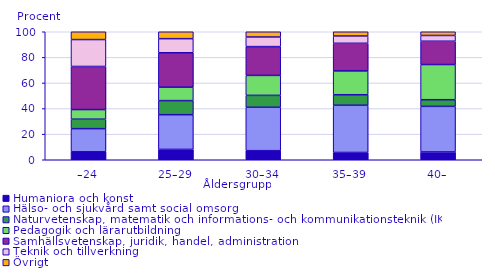
| Category | Humaniora och konst                                                                                                                                    | Hälso- och sjukvård samt social omsorg                                                                                                                 | Naturvetenskap, matematik och informations- och kommunikationsteknik (IKT)                                                                             | Pedagogik och lärarutbildning                                                                                                                          | Samhällsvetenskap, juridik, handel, administration                                                                                                     | Teknik och tillverkning                                                                                                                                | Övrigt |
|---|---|---|---|---|---|---|---|
| –24 | 6.2 | 18.1 | 7.4 | 7.5 | 33.7 | 21 | 6.6 |
| 25–29 | 8.1 | 27.1 | 11 | 10.5 | 26.9 | 11 | 6.1 |
| 30–34 | 7.1 | 33.9 | 9.3 | 15.6 | 22.5 | 7.5 | 5 |
| 35–39 | 5.7 | 36.9 | 8.2 | 18.6 | 21.6 | 5.7 | 4.2 |
| 40– | 6.1 | 35.6 | 5.2 | 27.5 | 18.2 | 4.5 | 3.7 |